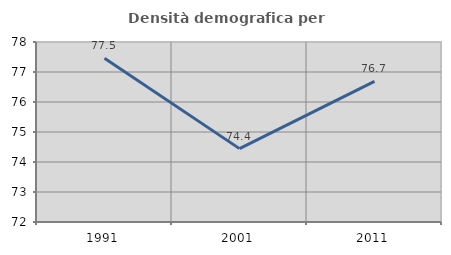
| Category | Densità demografica |
|---|---|
| 1991.0 | 77.462 |
| 2001.0 | 74.446 |
| 2011.0 | 76.686 |